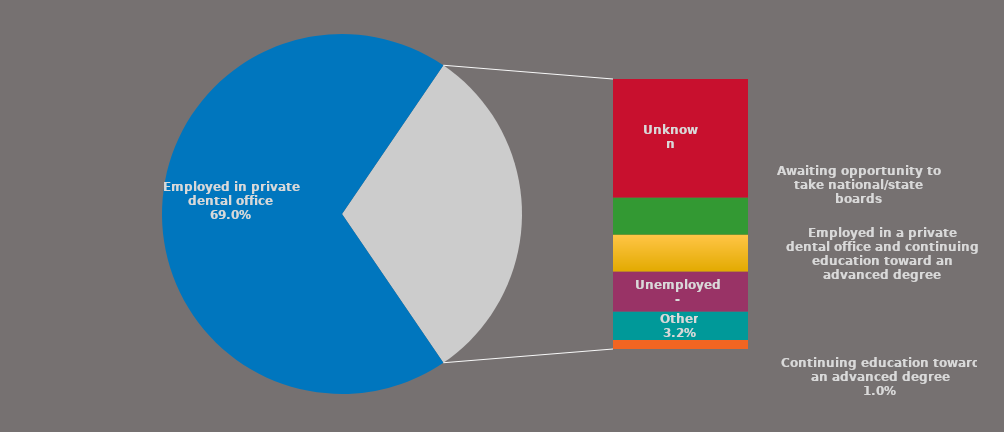
| Category | Series 0 |
|---|---|
| Employed in private dental office | 0.69 |
| Unknown | 0.136 |
| Awaiting opportunity to take national/state boards | 0.043 |
| Employed in a private dental office and continuing education toward an advanced degree | 0.043 |
| Unemployed - | 0.046 |
| Other | 0.032 |
| Continuing education toward an advanced degree | 0.01 |